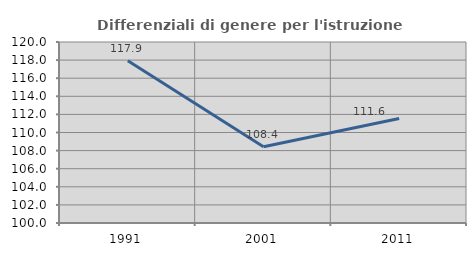
| Category | Differenziali di genere per l'istruzione superiore |
|---|---|
| 1991.0 | 117.926 |
| 2001.0 | 108.435 |
| 2011.0 | 111.557 |